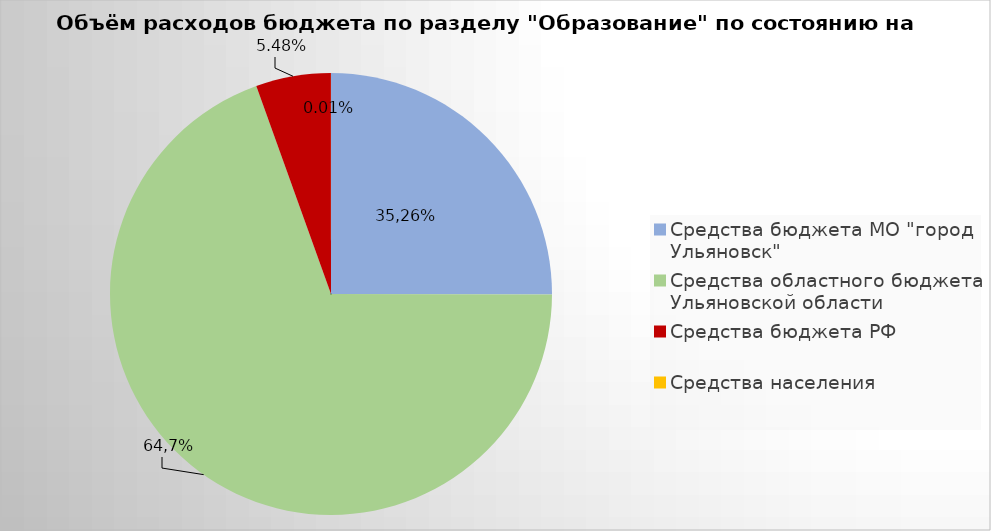
| Category | Series 0 |
|---|---|
| Средства бюджета МО "город Ульяновск" | 2200375.26 |
| Средства областного бюджета Ульяновской области | 6107370.19 |
| Средства бюджета РФ | 481889.61 |
| Средства населения | 558.01 |